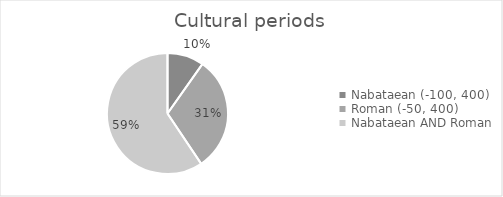
| Category | % of N&R datasets |
|---|---|
| Nabataean (-100, 400) | 0.098 |
| Roman (-50, 400) | 0.308 |
| Nabataean AND Roman | 0.594 |